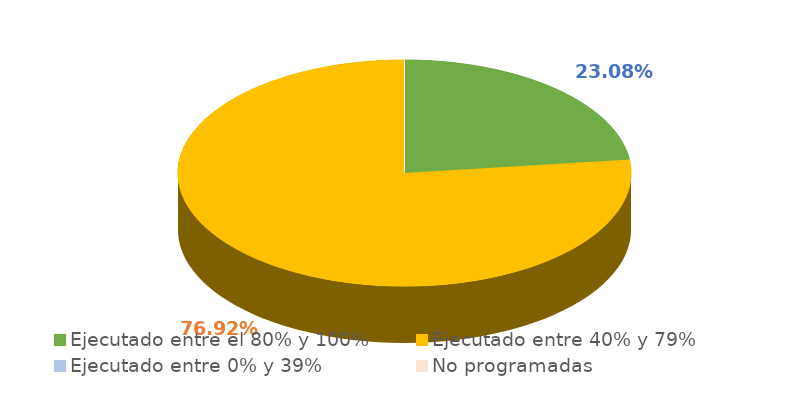
| Category | Series 0 |
|---|---|
| Ejecutado entre el 80% y 100% | 0.231 |
| Ejecutado entre 40% y 79% | 0.769 |
| Ejecutado entre 0% y 39% | 0 |
| No programadas | 0 |